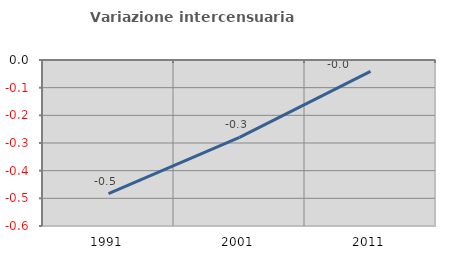
| Category | Variazione intercensuaria annua |
|---|---|
| 1991.0 | -0.483 |
| 2001.0 | -0.279 |
| 2011.0 | -0.041 |